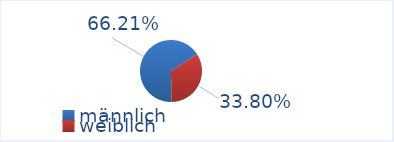
| Category | Series 0 |
|---|---|
| männlich | 66.208 |
| weiblich | 33.792 |